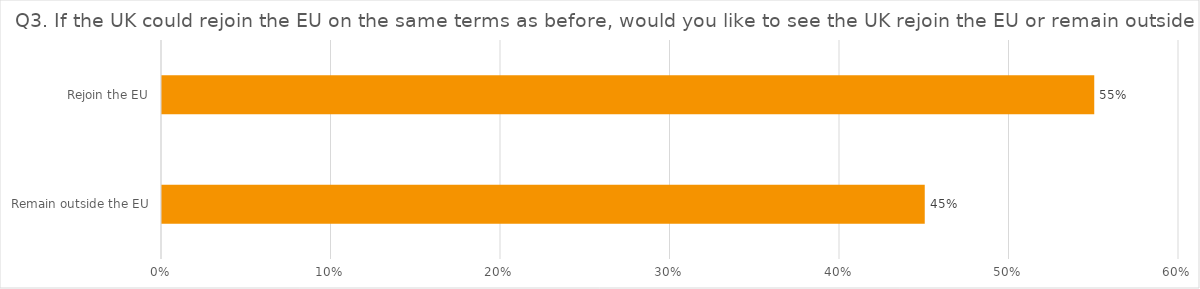
| Category | Q3. If the UK could rejoin the EU on the same terms as before, would you like to see the UK rejoin the EU or remain outside? |
|---|---|
| Remain outside the EU | 0.45 |
| Rejoin the EU | 0.55 |